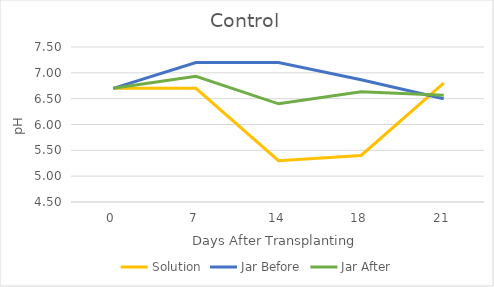
| Category | Solution | Jar Before | Jar After |
|---|---|---|---|
| 0.0 | 6.7 | 6.7 | 6.7 |
| 7.0 | 6.7 | 7.2 | 6.933 |
| 14.0 | 5.3 | 7.2 | 6.4 |
| 18.0 | 5.4 | 6.867 | 6.633 |
| 21.0 | 6.8 | 6.5 | 6.567 |